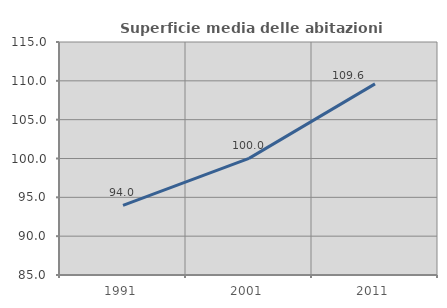
| Category | Superficie media delle abitazioni occupate |
|---|---|
| 1991.0 | 93.961 |
| 2001.0 | 100.014 |
| 2011.0 | 109.609 |